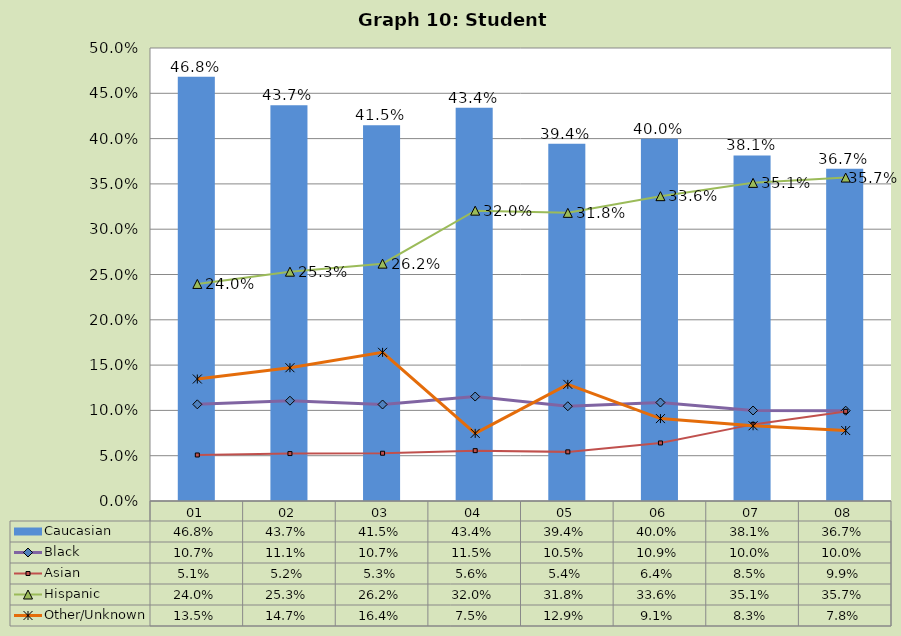
| Category | Caucasian |
|---|---|
| 01 | 0.468 |
| 02 | 0.437 |
| 03 | 0.415 |
| 04 | 0.434 |
| 05 | 0.394 |
| 06 | 0.4 |
| 07 | 0.381 |
| 08 | 0.367 |